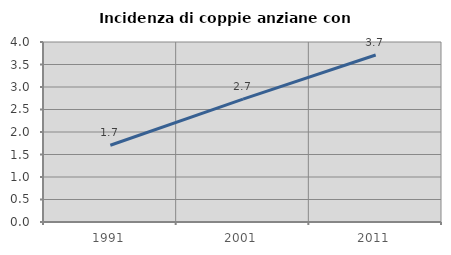
| Category | Incidenza di coppie anziane con figli |
|---|---|
| 1991.0 | 1.705 |
| 2001.0 | 2.73 |
| 2011.0 | 3.711 |